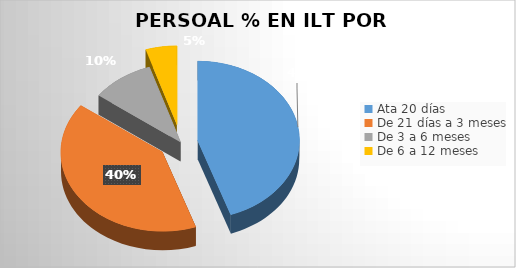
| Category | Series 0 |
|---|---|
| Ata 20 días | 135 |
| De 21 días a 3 meses | 122 |
| De 3 a 6 meses | 30 |
| De 6 a 12 meses | 15 |